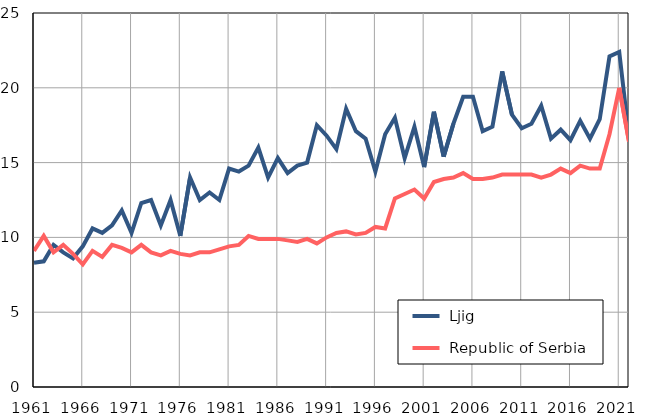
| Category |  Ljig |  Republic of Serbia |
|---|---|---|
| 1961.0 | 8.3 | 9.1 |
| 1962.0 | 8.4 | 10.1 |
| 1963.0 | 9.5 | 9 |
| 1964.0 | 9 | 9.5 |
| 1965.0 | 8.6 | 8.9 |
| 1966.0 | 9.4 | 8.2 |
| 1967.0 | 10.6 | 9.1 |
| 1968.0 | 10.3 | 8.7 |
| 1969.0 | 10.8 | 9.5 |
| 1970.0 | 11.8 | 9.3 |
| 1971.0 | 10.3 | 9 |
| 1972.0 | 12.3 | 9.5 |
| 1973.0 | 12.5 | 9 |
| 1974.0 | 10.8 | 8.8 |
| 1975.0 | 12.5 | 9.1 |
| 1976.0 | 10.1 | 8.9 |
| 1977.0 | 14 | 8.8 |
| 1978.0 | 12.5 | 9 |
| 1979.0 | 13 | 9 |
| 1980.0 | 12.5 | 9.2 |
| 1981.0 | 14.6 | 9.4 |
| 1982.0 | 14.4 | 9.5 |
| 1983.0 | 14.8 | 10.1 |
| 1984.0 | 16 | 9.9 |
| 1985.0 | 14 | 9.9 |
| 1986.0 | 15.3 | 9.9 |
| 1987.0 | 14.3 | 9.8 |
| 1988.0 | 14.8 | 9.7 |
| 1989.0 | 15 | 9.9 |
| 1990.0 | 17.5 | 9.6 |
| 1991.0 | 16.8 | 10 |
| 1992.0 | 15.9 | 10.3 |
| 1993.0 | 18.6 | 10.4 |
| 1994.0 | 17.1 | 10.2 |
| 1995.0 | 16.6 | 10.3 |
| 1996.0 | 14.4 | 10.7 |
| 1997.0 | 16.9 | 10.6 |
| 1998.0 | 18 | 12.6 |
| 1999.0 | 15.3 | 12.9 |
| 2000.0 | 17.4 | 13.2 |
| 2001.0 | 14.7 | 12.6 |
| 2002.0 | 18.4 | 13.7 |
| 2003.0 | 15.4 | 13.9 |
| 2004.0 | 17.6 | 14 |
| 2005.0 | 19.4 | 14.3 |
| 2006.0 | 19.4 | 13.9 |
| 2007.0 | 17.1 | 13.9 |
| 2008.0 | 17.4 | 14 |
| 2009.0 | 21.1 | 14.2 |
| 2010.0 | 18.2 | 14.2 |
| 2011.0 | 17.3 | 14.2 |
| 2012.0 | 17.6 | 14.2 |
| 2013.0 | 18.8 | 14 |
| 2014.0 | 16.6 | 14.2 |
| 2015.0 | 17.2 | 14.6 |
| 2016.0 | 16.5 | 14.3 |
| 2017.0 | 17.8 | 14.8 |
| 2018.0 | 16.6 | 14.6 |
| 2019.0 | 17.9 | 14.6 |
| 2020.0 | 22.1 | 16.9 |
| 2021.0 | 22.4 | 20 |
| 2022.0 | 16.7 | 16.4 |